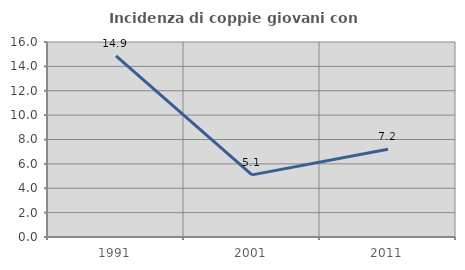
| Category | Incidenza di coppie giovani con figli |
|---|---|
| 1991.0 | 14.865 |
| 2001.0 | 5.098 |
| 2011.0 | 7.2 |